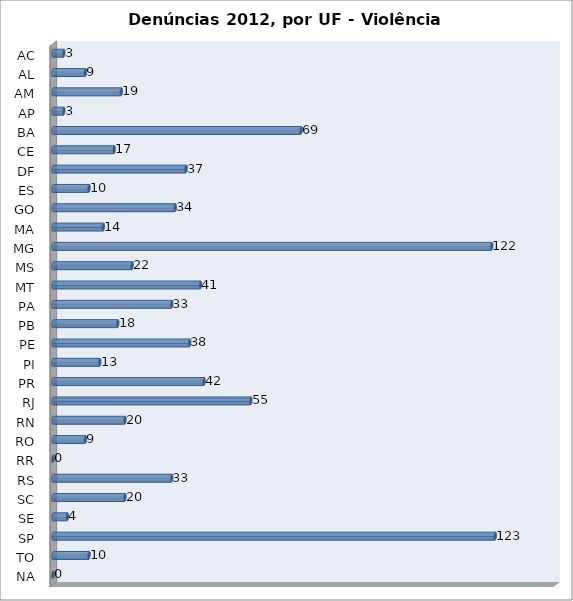
| Category | Series 0 |
|---|---|
| AC | 3 |
| AL | 9 |
| AM | 19 |
| AP | 3 |
| BA | 69 |
| CE | 17 |
| DF | 37 |
| ES | 10 |
| GO | 34 |
| MA | 14 |
| MG | 122 |
| MS | 22 |
| MT | 41 |
| PA | 33 |
| PB | 18 |
| PE | 38 |
| PI | 13 |
| PR | 42 |
| RJ | 55 |
| RN | 20 |
| RO | 9 |
| RR | 0 |
| RS | 33 |
| SC | 20 |
| SE | 4 |
| SP | 123 |
| TO | 10 |
| NA | 0 |